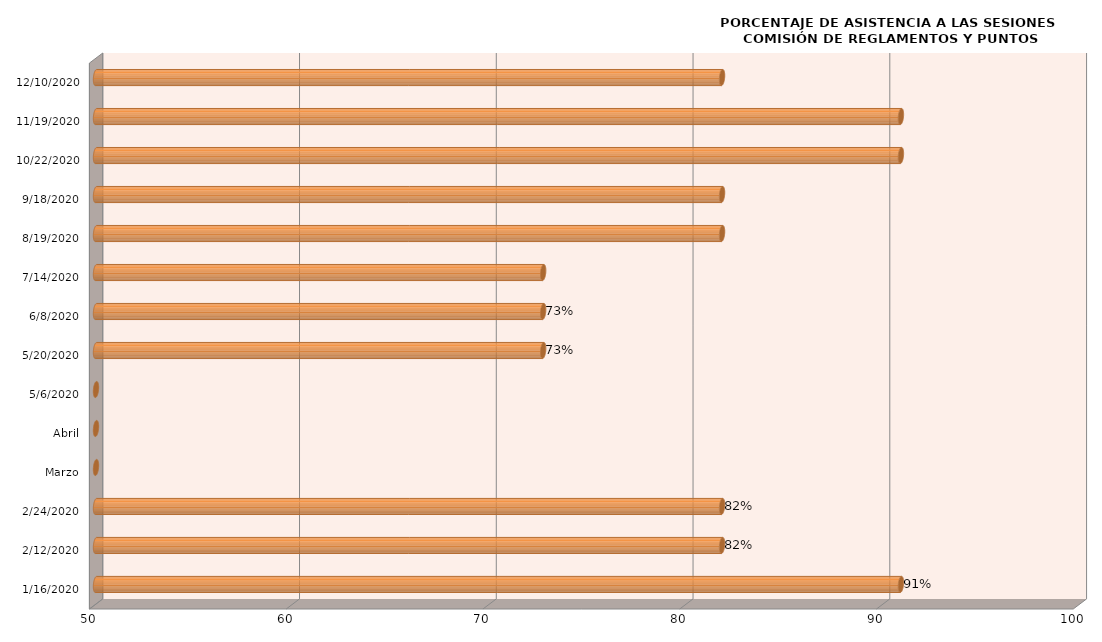
| Category | Series 0 |
|---|---|
| 1/16/2020 | 90.909 |
| 2/12/2020 | 81.818 |
| 2/24/2020 | 81.818 |
| Marzo | 0 |
| Abril | 0 |
| 5/6/2020 | 0 |
| 5/20/2020 | 72.727 |
| 6/8/2020 | 72.727 |
| 7/14/2020 | 72.727 |
| 8/19/2020 | 81.818 |
| 9/18/2020 | 81.818 |
| 10/22/2020 | 90.909 |
| 11/19/2020 | 90.909 |
| 12/10/2020 | 81.818 |